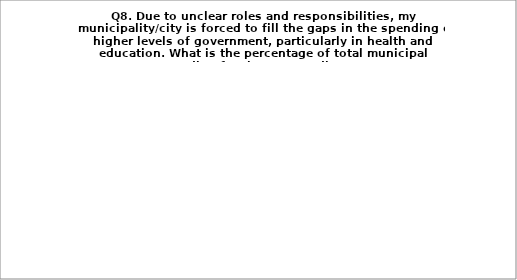
| Category | Series 0 |
|---|---|
| Up to 3% of total spending | 29.31 |
| Up to 5% of total spending  | 25.862 |
| Up to 10% of total spending  | 22.414 |
| Up to 15% of total spending  | 5.172 |
| At least 20% of total spending | 12.069 |
| My municipality/city has no such expenditures | 5.172 |